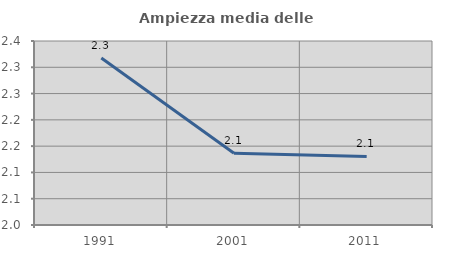
| Category | Ampiezza media delle famiglie |
|---|---|
| 1991.0 | 2.318 |
| 2001.0 | 2.136 |
| 2011.0 | 2.13 |